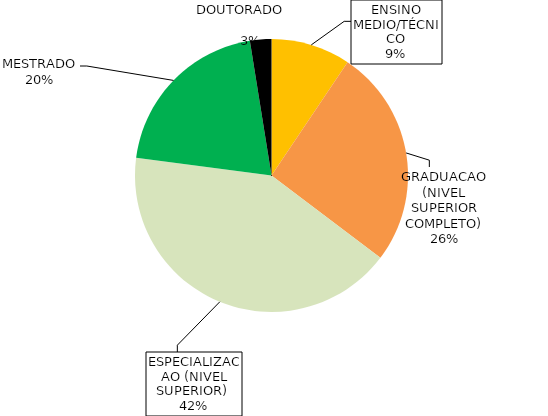
| Category | Series 0 |
|---|---|
| ENSINO MEDIO/TÉCNICO | 0.094 |
| GRADUACAO (NIVEL SUPERIOR COMPLETO) | 0.259 |
| ESPECIALIZACAO (NIVEL SUPERIOR)  | 0.418 |
| MESTRADO | 0.204 |
| DOUTORADO                             | 0.025 |